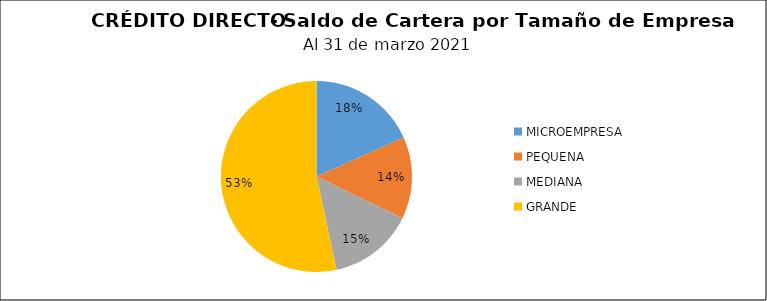
| Category | Saldo | Créditos |
|---|---|---|
| MICROEMPRESA | 24.48 | 6 |
| PEQUENA | 18.617 | 15 |
| MEDIANA | 19.33 | 18 |
| GRANDE | 71.443 | 14 |